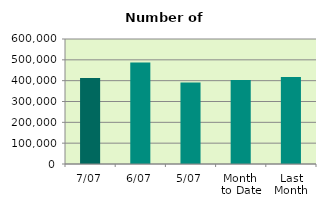
| Category | Series 0 |
|---|---|
| 7/07 | 412576 |
| 6/07 | 486956 |
| 5/07 | 391708 |
| Month 
to Date | 402658 |
| Last
Month | 418146.182 |